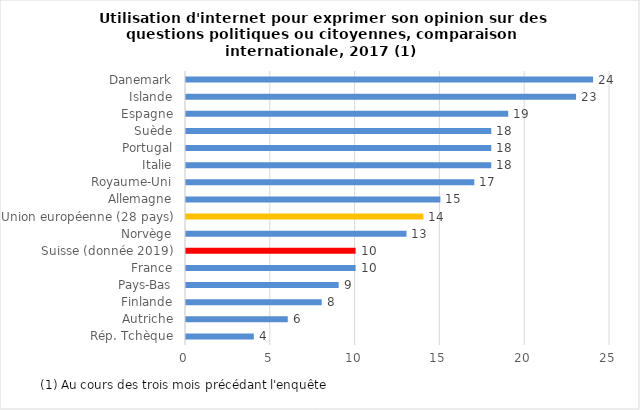
| Category | Series 0 |
|---|---|
| Rép. Tchèque | 4 |
| Autriche | 6 |
| Finlande | 8 |
| Pays-Bas | 9 |
| France | 10 |
| Suisse (donnée 2019) | 10 |
| Norvège | 13 |
| Union européenne (28 pays) | 14 |
| Allemagne | 15 |
| Royaume-Uni | 17 |
| Italie | 18 |
| Portugal | 18 |
| Suède | 18 |
| Espagne | 19 |
| Islande | 23 |
| Danemark | 24 |